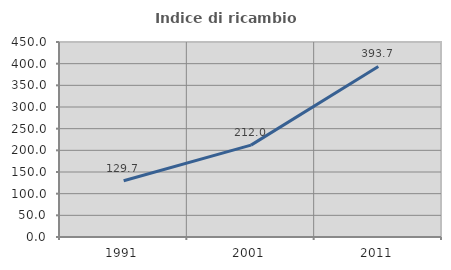
| Category | Indice di ricambio occupazionale  |
|---|---|
| 1991.0 | 129.7 |
| 2001.0 | 211.977 |
| 2011.0 | 393.689 |